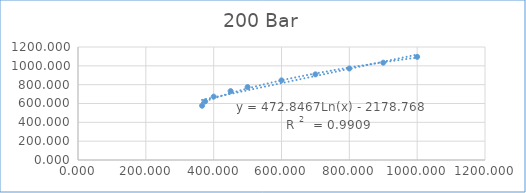
| Category | Series 0 |
|---|---|
| 365.8 | 576.278 |
| 375.0 | 621.739 |
| 400.0 | 672.934 |
| 450.0 | 731.414 |
| 500.0 | 774.295 |
| 600.0 | 845.437 |
| 700.0 | 909.651 |
| 800.0 | 971.691 |
| 900.0 | 1033.301 |
| 1000.0 | 1095.246 |